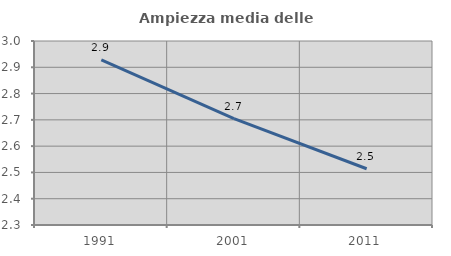
| Category | Ampiezza media delle famiglie |
|---|---|
| 1991.0 | 2.928 |
| 2001.0 | 2.705 |
| 2011.0 | 2.514 |